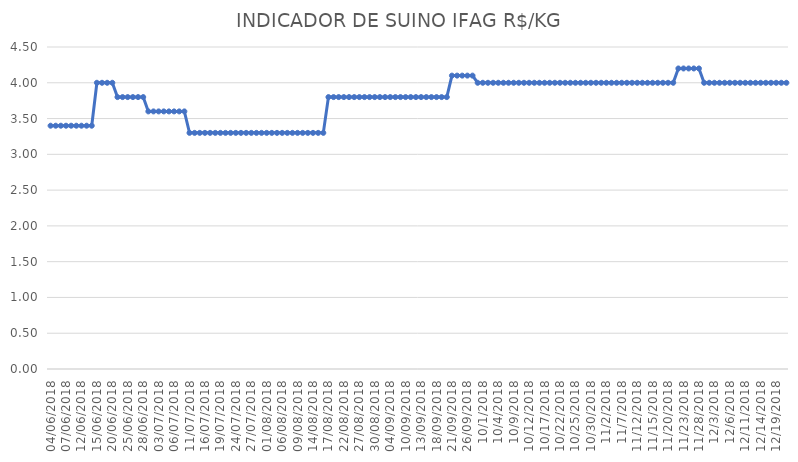
| Category | INDICADOR DE SUINO IFAG |
|---|---|
| 04/06/2018 | 3.4 |
| 05/06/2018 | 3.4 |
| 06/06/2018 | 3.4 |
| 07/06/2018 | 3.4 |
| 08/06/2018 | 3.4 |
| 11/06/2018 | 3.4 |
| 12/06/2018 | 3.4 |
| 13/06/2018 | 3.4 |
| 14/06/2018 | 3.4 |
| 15/06/2018 | 4 |
| 18/06/2018 | 4 |
| 19/06/2018 | 4 |
| 20/06/2018 | 4 |
| 21/06/2018 | 3.8 |
| 22/06/2018 | 3.8 |
| 25/06/2018 | 3.8 |
| 26/06/2018 | 3.8 |
| 27/06/2018 | 3.8 |
| 28/06/2018 | 3.8 |
| 29/06/2018 | 3.6 |
| 02/07/2018 | 3.6 |
| 03/07/2018 | 3.6 |
| 04/07/2018 | 3.6 |
| 05/07/2018 | 3.6 |
| 06/07/2018 | 3.6 |
| 09/07/2018 | 3.6 |
| 10/07/2018 | 3.6 |
| 11/07/2018 | 3.3 |
| 12/07/2018 | 3.3 |
| 13/07/2018 | 3.3 |
| 16/07/2018 | 3.3 |
| 17/07/2018 | 3.3 |
| 18/07/2018 | 3.3 |
| 19/07/2018 | 3.3 |
| 20/07/2018 | 3.3 |
| 23/07/2018 | 3.3 |
| 24/07/2018 | 3.3 |
| 25/07/2018 | 3.3 |
| 26/07/2018 | 3.3 |
| 27/07/2018 | 3.3 |
| 30/07/2018 | 3.3 |
| 31/07/2018 | 3.3 |
| 01/08/2018 | 3.3 |
| 02/08/2018 | 3.3 |
| 03/08/2018 | 3.3 |
| 06/08/2018 | 3.3 |
| 07/08/2018 | 3.3 |
| 08/08/2018 | 3.3 |
| 09/08/2018 | 3.3 |
| 10/08/2018 | 3.3 |
| 13/08/2018 | 3.3 |
| 14/08/2018 | 3.3 |
| 15/08/2018 | 3.3 |
| 16/08/2018 | 3.3 |
| 17/08/2018 | 3.8 |
| 20/08/2018 | 3.8 |
| 21/08/2018 | 3.8 |
| 22/08/2018 | 3.8 |
| 23/08/2018 | 3.8 |
| 24/08/2018 | 3.8 |
| 27/08/2018 | 3.8 |
| 28/08/2018 | 3.8 |
| 29/08/2018 | 3.8 |
| 30/08/2018 | 3.8 |
| 31/08/2018 | 3.8 |
| 03/09/2018 | 3.8 |
| 04/09/2018 | 3.8 |
| 05/09/2018 | 3.8 |
| 06/09/2018 | 3.8 |
| 10/09/2018 | 3.8 |
| 11/09/2018 | 3.8 |
| 12/09/2018 | 3.8 |
| 13/09/2018 | 3.8 |
| 14/09/2018 | 3.8 |
| 17/09/2018 | 3.8 |
| 18/09/2018 | 3.8 |
| 19/09/2018 | 3.8 |
| 20/09/2018 | 3.8 |
| 21/09/2018 | 4.1 |
| 24/09/2018 | 4.1 |
| 25/09/2018 | 4.1 |
| 26/09/2018 | 4.1 |
| 27/09/2018 | 4.1 |
| 28/09/2018 | 4 |
| 01/10/2018 | 4 |
| 02/10/2018 | 4 |
| 03/10/2018 | 4 |
| 04/10/2018 | 4 |
| 05/10/2018 | 4 |
| 08/10/2018 | 4 |
| 09/10/2018 | 4 |
| 10/10/2018 | 4 |
| 11/10/2018 | 4 |
| 12/10/2018 | 4 |
| 15/10/2018 | 4 |
| 16/10/2018 | 4 |
| 17/10/2018 | 4 |
| 18/10/2018 | 4 |
| 19/10/2018 | 4 |
| 22/10/2018 | 4 |
| 23/10/2018 | 4 |
| 24/10/2018 | 4 |
| 25/10/2018 | 4 |
| 26/10/2018 | 4 |
| 29/10/2018 | 4 |
| 30/10/2018 | 4 |
| 31/10/2018 | 4 |
| 01/11/2018 | 4 |
| 02/11/2018 | 4 |
| 05/11/2018 | 4 |
| 06/11/2018 | 4 |
| 07/11/2018 | 4 |
| 08/11/2018 | 4 |
| 09/11/2018 | 4 |
| 12/11/2018 | 4 |
| 13/11/2018 | 4 |
| 14/11/2018 | 4 |
| 15/11/2018 | 4 |
| 16/11/2018 | 4 |
| 19/11/2018 | 4 |
| 20/11/2018 | 4 |
| 21/11/2018 | 4 |
| 22/11/2018 | 4.2 |
| 23/11/2018 | 4.2 |
| 26/11/2018 | 4.2 |
| 27/11/2018 | 4.2 |
| 28/11/2018 | 4.2 |
| 29/11/2018 | 4 |
| 30/11/2018 | 4 |
| 03/12/2018 | 4 |
| 04/12/2018 | 4 |
| 05/12/2018 | 4 |
| 06/12/2018 | 4 |
| 07/12/2018 | 4 |
| 10/12/2018 | 4 |
| 11/12/2018 | 4 |
| 12/12/2018 | 4 |
| 13/12/2018 | 4 |
| 14/12/2018 | 4 |
| 17/12/2018 | 4 |
| 18/12/2018 | 4 |
| 19/12/2018 | 4 |
| 20/12/2018 | 4 |
| 21/12/2018 | 4 |